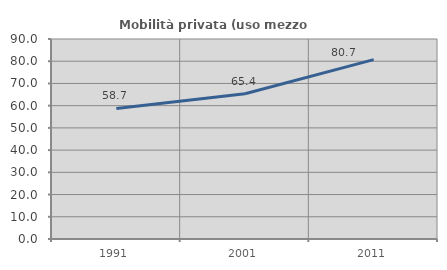
| Category | Mobilità privata (uso mezzo privato) |
|---|---|
| 1991.0 | 58.73 |
| 2001.0 | 65.385 |
| 2011.0 | 80.714 |